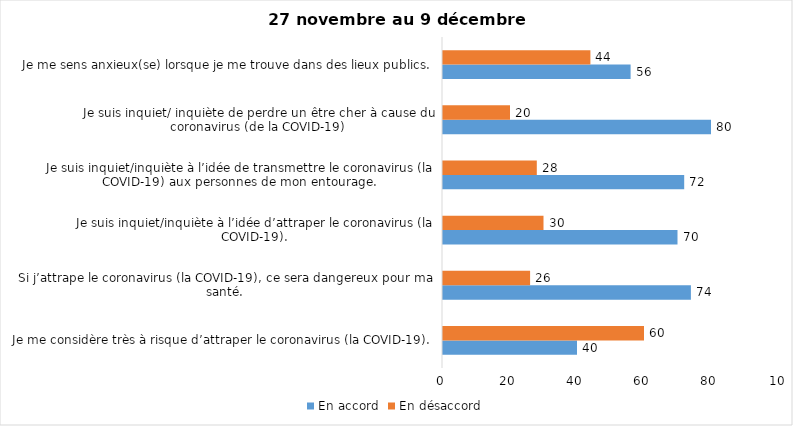
| Category | En accord | En désaccord |
|---|---|---|
| Je me considère très à risque d’attraper le coronavirus (la COVID-19). | 40 | 60 |
| Si j’attrape le coronavirus (la COVID-19), ce sera dangereux pour ma santé. | 74 | 26 |
| Je suis inquiet/inquiète à l’idée d’attraper le coronavirus (la COVID-19). | 70 | 30 |
| Je suis inquiet/inquiète à l’idée de transmettre le coronavirus (la COVID-19) aux personnes de mon entourage. | 72 | 28 |
| Je suis inquiet/ inquiète de perdre un être cher à cause du coronavirus (de la COVID-19) | 80 | 20 |
| Je me sens anxieux(se) lorsque je me trouve dans des lieux publics. | 56 | 44 |